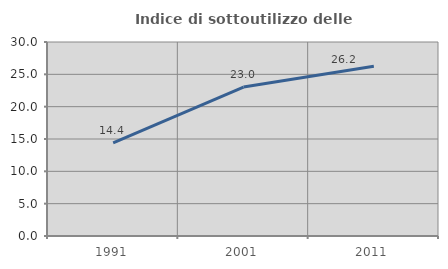
| Category | Indice di sottoutilizzo delle abitazioni  |
|---|---|
| 1991.0 | 14.414 |
| 2001.0 | 23.041 |
| 2011.0 | 26.239 |